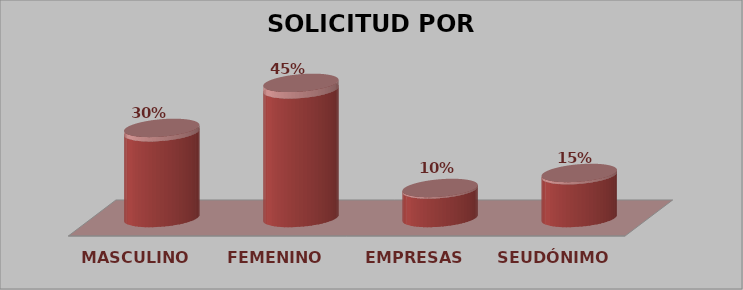
| Category | SOLICITUD POR SEXO | Series 1 |
|---|---|---|
| MASCULINO | 6 | 0.3 |
| FEMENINO | 9 | 0.45 |
| EMPRESAS | 2 | 0.1 |
| SEUDÓNIMO | 3 | 0.15 |